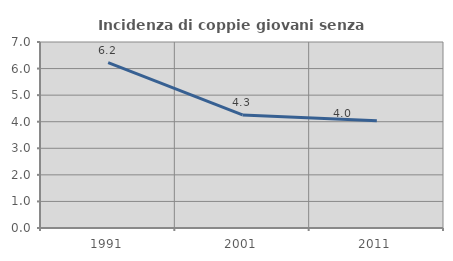
| Category | Incidenza di coppie giovani senza figli |
|---|---|
| 1991.0 | 6.224 |
| 2001.0 | 4.255 |
| 2011.0 | 4.035 |